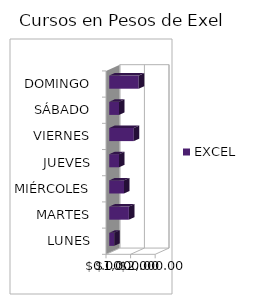
| Category | EXCEL |
|---|---|
| LUNES | 200 |
| MARTES | 800 |
| MIÉRCOLES | 600 |
| JUEVES | 400 |
| VIERNES | 1000 |
| SÁBADO | 400 |
| DOMINGO | 1200 |